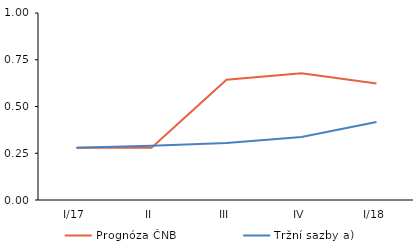
| Category | Prognóza ČNB | Tržní sazby a) |
|---|---|---|
| I/17 | 0.28 | 0.28 |
| II | 0.28 | 0.29 |
| III | 0.643 | 0.305 |
| IV | 0.677 | 0.338 |
| I/18 | 0.623 | 0.418 |